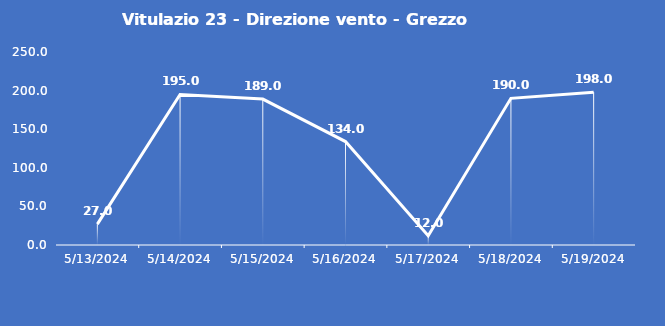
| Category | Vitulazio 23 - Direzione vento - Grezzo (°N) |
|---|---|
| 5/13/24 | 27 |
| 5/14/24 | 195 |
| 5/15/24 | 189 |
| 5/16/24 | 134 |
| 5/17/24 | 12 |
| 5/18/24 | 190 |
| 5/19/24 | 198 |